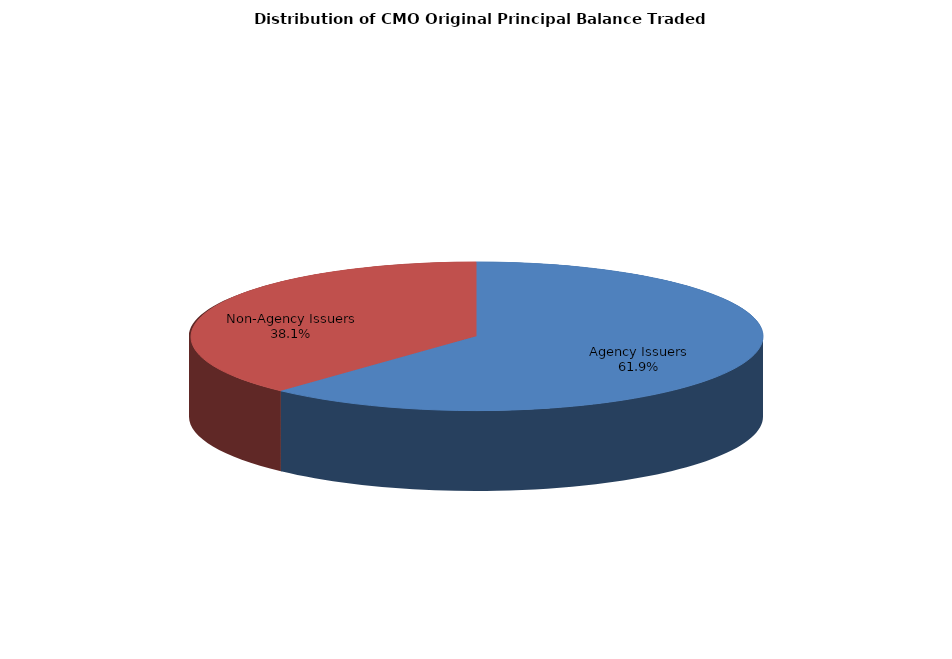
| Category | Series 0 |
|---|---|
| Agency Issuers | 9072857341.427 |
| Non-Agency Issuers | 5585909569.608 |